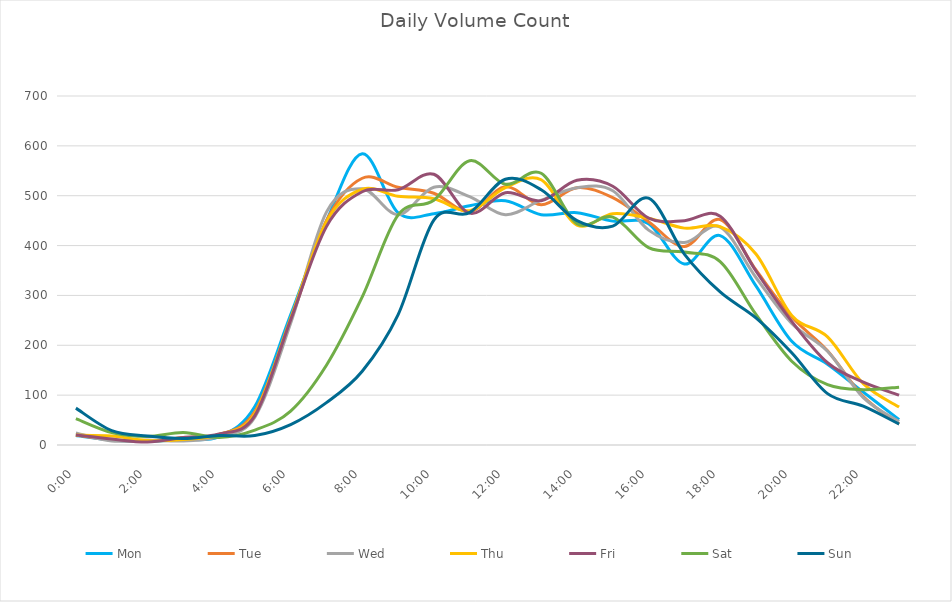
| Category | Mon | Tue | Wed | Thu | Fri | Sat | Sun |
|---|---|---|---|---|---|---|---|
| 0.0 | 19 | 20 | 24 | 20 | 20 | 53 | 74 |
| 0.0416666666666667 | 10 | 10 | 8 | 18 | 12 | 25 | 29 |
| 0.0833333333333333 | 7 | 8 | 10 | 9 | 6 | 17 | 18 |
| 0.125 | 11 | 15 | 8 | 11 | 15 | 25 | 13 |
| 0.166666666666667 | 17 | 21 | 17 | 21 | 22 | 15 | 19 |
| 0.208333333333333 | 77 | 67 | 56 | 63 | 59 | 30 | 19 |
| 0.25 | 261 | 250 | 244 | 254 | 251 | 68 | 41 |
| 0.291666666666667 | 449 | 450 | 467 | 448 | 438 | 160 | 85 |
| 0.333333333333333 | 584 | 535 | 514 | 513 | 508 | 297 | 148 |
| 0.375 | 466 | 517 | 462 | 499 | 512 | 461 | 261 |
| 0.416666666666667 | 464 | 505 | 517 | 494 | 543 | 491 | 451 |
| 0.4583333333333333 | 480 | 468 | 498 | 470 | 465 | 570 | 466 |
| 0.5 | 490 | 518 | 462 | 516 | 506 | 523 | 533 |
| 0.541666666666667 | 462 | 482 | 491 | 532 | 490 | 545 | 512 |
| 0.5833333333333334 | 466 | 516 | 516 | 441 | 531 | 444 | 450 |
| 0.625 | 449 | 496 | 510 | 464 | 519 | 457 | 439 |
| 0.666666666666667 | 444 | 448 | 431 | 455 | 455 | 396 | 495 |
| 0.7083333333333334 | 363 | 398 | 406 | 435 | 450 | 387 | 383 |
| 0.75 | 420 | 452 | 437 | 438 | 459 | 368 | 307 |
| 0.791666666666667 | 319 | 351 | 336 | 383 | 349 | 262 | 255 |
| 0.8333333333333334 | 208 | 257 | 244 | 260 | 248 | 168 | 185 |
| 0.875 | 162 | 189 | 188 | 217 | 165 | 121 | 103 |
| 0.916666666666667 | 106 | 97 | 95 | 123 | 126 | 111 | 78 |
| 0.9583333333333334 | 51 | 42 | 47 | 76 | 100 | 116 | 42 |